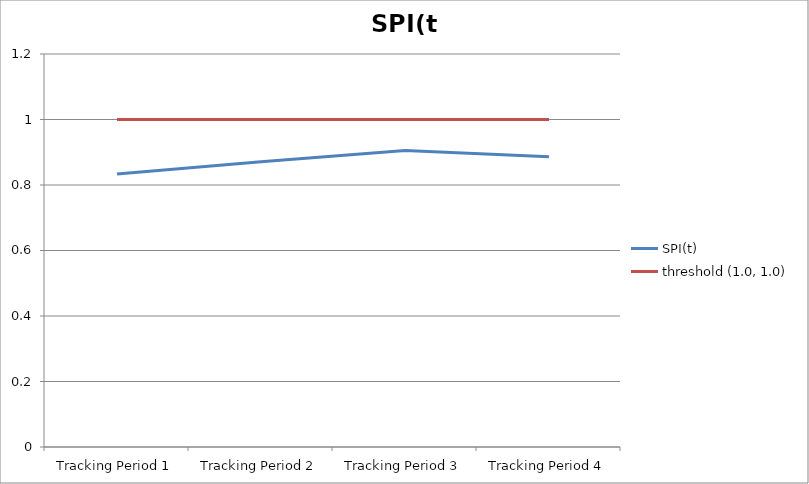
| Category | SPI(t) | threshold (1.0, 1.0) |
|---|---|---|
| Tracking Period 1 | 0.833 | 1 |
| Tracking Period 2 | 0.871 | 1 |
| Tracking Period 3 | 0.905 | 1 |
| Tracking Period 4 | 0.886 | 1 |